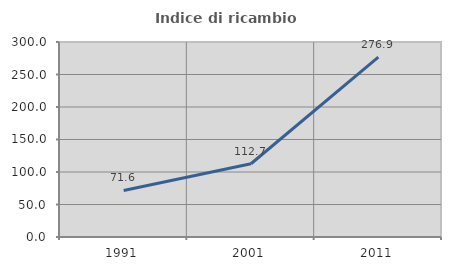
| Category | Indice di ricambio occupazionale  |
|---|---|
| 1991.0 | 71.631 |
| 2001.0 | 112.705 |
| 2011.0 | 276.875 |